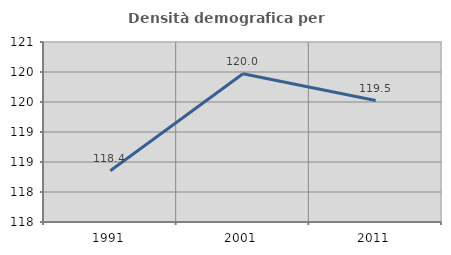
| Category | Densità demografica |
|---|---|
| 1991.0 | 118.353 |
| 2001.0 | 119.97 |
| 2011.0 | 119.525 |